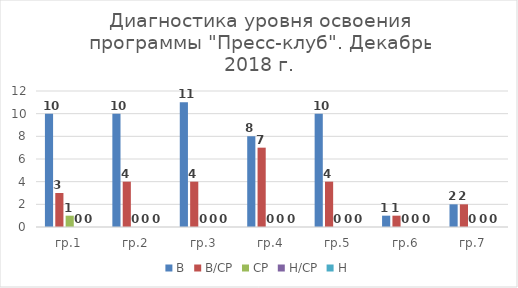
| Category | В | В/СР | СР | Н/СР | Н |
|---|---|---|---|---|---|
| гр.1 | 10 | 3 | 1 | 0 | 0 |
| гр.2 | 10 | 4 | 0 | 0 | 0 |
| гр.3 | 11 | 4 | 0 | 0 | 0 |
| гр.4 | 8 | 7 | 0 | 0 | 0 |
| гр.5 | 10 | 4 | 0 | 0 | 0 |
| гр.6 | 1 | 1 | 0 | 0 | 0 |
| гр.7 | 2 | 2 | 0 | 0 | 0 |